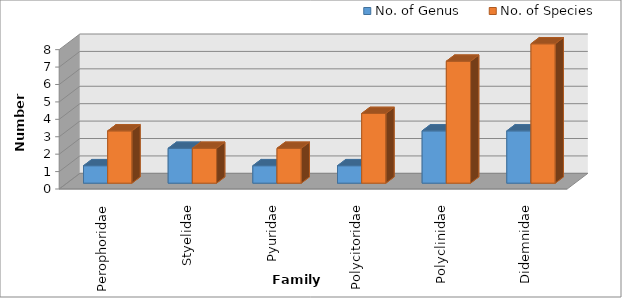
| Category | No. of Genus | No. of Species |
|---|---|---|
| Perophoridae | 1 | 3 |
| Styelidae | 2 | 2 |
| Pyuridae | 1 | 2 |
| Polycitoridae | 1 | 4 |
| Polyclinidae | 3 | 7 |
| Didemnidae | 3 | 8 |